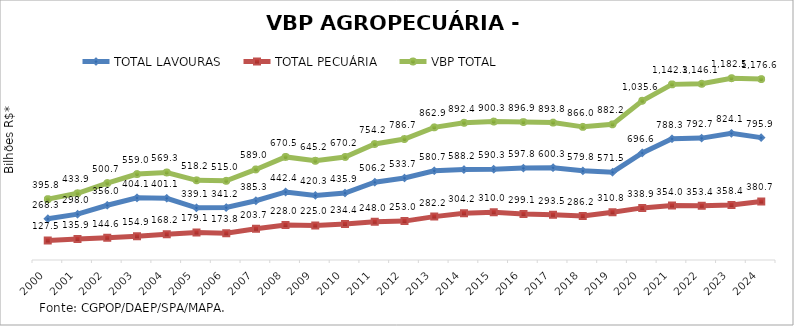
| Category | TOTAL LAVOURAS | TOTAL PECUÁRIA | VBP TOTAL |
|---|---|---|---|
| 2000 | 268.308 | 127.52 | 395.828 |
| 2001 | 298.041 | 135.88 | 433.921 |
| 2002 | 356.02 | 144.636 | 500.657 |
| 2003 | 404.08 | 154.925 | 559.005 |
| 2004 | 401.122 | 168.177 | 569.299 |
| 2005 | 339.13 | 179.077 | 518.207 |
| 2006 | 341.202 | 173.841 | 515.043 |
| 2007 | 385.326 | 203.705 | 589.031 |
| 2008 | 442.449 | 228.008 | 670.457 |
| 2009 | 420.268 | 224.978 | 645.246 |
| 2010 | 435.864 | 234.357 | 670.222 |
| 2011 | 506.202 | 248.027 | 754.229 |
| 2012 | 533.729 | 252.972 | 786.701 |
| 2013 | 580.701 | 282.206 | 862.907 |
| 2014 | 588.172 | 304.185 | 892.357 |
| 2015 | 590.306 | 310.029 | 900.335 |
| 2016 | 597.771 | 299.146 | 896.917 |
| 2017 | 600.252 | 293.542 | 893.795 |
| 2018 | 579.81 | 286.18 | 865.991 |
| 2019 | 571.472 | 310.77 | 882.242 |
| 2020 | 696.638 | 338.941 | 1035.579 |
| 2021 | 788.263 | 354.029 | 1142.292 |
| 2022 | 792.704 | 353.444 | 1146.148 |
| 2023 | 824.132 | 358.362 | 1182.494 |
| 2024 | 795.894 | 380.667 | 1176.561 |